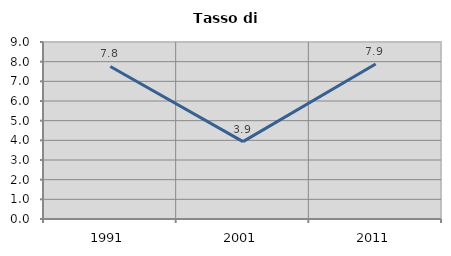
| Category | Tasso di disoccupazione   |
|---|---|
| 1991.0 | 7.757 |
| 2001.0 | 3.933 |
| 2011.0 | 7.882 |